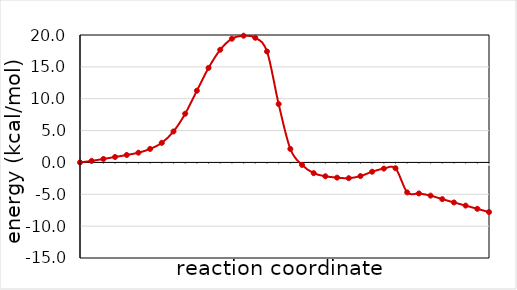
| Category | Series 0 |
|---|---|
| 1.0 | 0 |
| 2.0 | 0.239 |
| 3.0 | 0.541 |
| 4.0 | 0.856 |
| 5.0 | 1.168 |
| 6.0 | 1.529 |
| 7.0 | 2.116 |
| 8.0 | 3.073 |
| 9.0 | 4.857 |
| 10.0 | 7.642 |
| 11.0 | 11.26 |
| 12.0 | 14.834 |
| 13.0 | 17.684 |
| 14.0 | 19.417 |
| 15.0 | 19.891 |
| 16.0 | 19.567 |
| 17.0 | 17.419 |
| 18.0 | 9.163 |
| 19.0 | 2.114 |
| 20.0 | -0.389 |
| 21.0 | -1.686 |
| 22.0 | -2.172 |
| 23.0 | -2.384 |
| 24.0 | -2.474 |
| 25.0 | -2.146 |
| 26.0 | -1.459 |
| 27.0 | -0.97 |
| 28.0 | -0.913 |
| 29.0 | -4.707 |
| 30.0 | -4.87 |
| 31.0 | -5.211 |
| 32.0 | -5.761 |
| 33.0 | -6.283 |
| 34.0 | -6.776 |
| 35.0 | -7.279 |
| 36.0 | -7.792 |